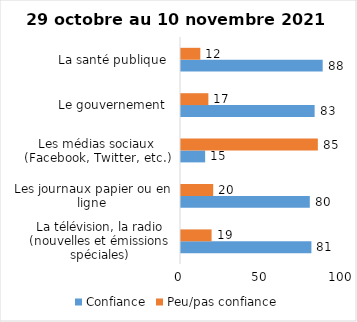
| Category | Confiance | Peu/pas confiance |
|---|---|---|
| La télévision, la radio (nouvelles et émissions spéciales) | 81 | 19 |
| Les journaux papier ou en ligne | 80 | 20 |
| Les médias sociaux (Facebook, Twitter, etc.) | 15 | 85 |
| Le gouvernement  | 83 | 17 |
| La santé publique  | 88 | 12 |